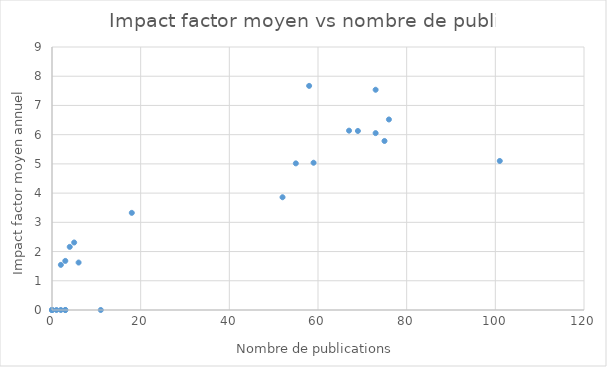
| Category | Series 0 |
|---|---|
| 1.0 | 0 |
| 0.0 | 0 |
| 2.0 | 0 |
| 3.0 | 0 |
| 0.0 | 0 |
| 3.0 | 0 |
| 0.0 | 0 |
| 2.0 | 1.545 |
| 4.0 | 2.16 |
| 3.0 | 1.68 |
| 5.0 | 2.31 |
| 6.0 | 1.624 |
| 18.0 | 3.325 |
| 55.0 | 5.018 |
| 59.0 | 5.039 |
| 76.0 | 6.52 |
| 58.0 | 7.67 |
| 73.0 | 7.537 |
| 69.0 | 6.127 |
| 73.0 | 6.053 |
| 67.0 | 6.137 |
| 75.0 | 5.784 |
| 101.0 | 5.1 |
| 52.0 | 3.859 |
| 11.0 | 0 |